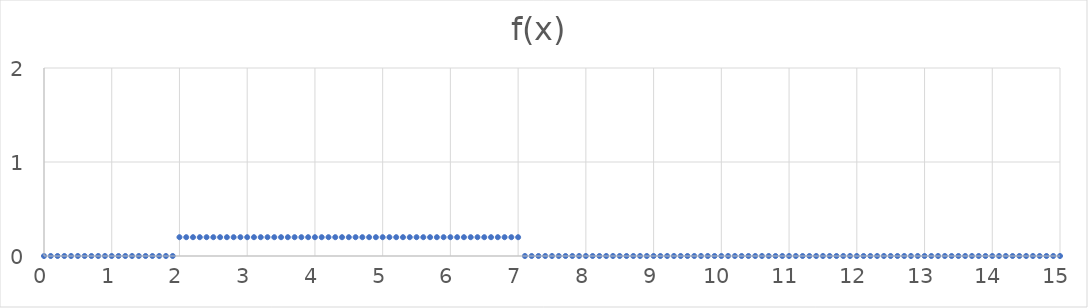
| Category | Series 0 |
|---|---|
| 0.0 | 0 |
| 0.1 | 0 |
| 0.2 | 0 |
| 0.3 | 0 |
| 0.4 | 0 |
| 0.5 | 0 |
| 0.6 | 0 |
| 0.7 | 0 |
| 0.8 | 0 |
| 0.9 | 0 |
| 1.0 | 0 |
| 1.1 | 0 |
| 1.2 | 0 |
| 1.3 | 0 |
| 1.4 | 0 |
| 1.5 | 0 |
| 1.6 | 0 |
| 1.7 | 0 |
| 1.8 | 0 |
| 1.9 | 0 |
| 2.0 | 0.2 |
| 2.1 | 0.2 |
| 2.2 | 0.2 |
| 2.3 | 0.2 |
| 2.4 | 0.2 |
| 2.5 | 0.2 |
| 2.6 | 0.2 |
| 2.7 | 0.2 |
| 2.8 | 0.2 |
| 2.9 | 0.2 |
| 3.0 | 0.2 |
| 3.1 | 0.2 |
| 3.2 | 0.2 |
| 3.3 | 0.2 |
| 3.4 | 0.2 |
| 3.5 | 0.2 |
| 3.6 | 0.2 |
| 3.7 | 0.2 |
| 3.8 | 0.2 |
| 3.9 | 0.2 |
| 4.0 | 0.2 |
| 4.1 | 0.2 |
| 4.2 | 0.2 |
| 4.3 | 0.2 |
| 4.4 | 0.2 |
| 4.5 | 0.2 |
| 4.6 | 0.2 |
| 4.7 | 0.2 |
| 4.8 | 0.2 |
| 4.9 | 0.2 |
| 5.0 | 0.2 |
| 5.1 | 0.2 |
| 5.2 | 0.2 |
| 5.3 | 0.2 |
| 5.4 | 0.2 |
| 5.5 | 0.2 |
| 5.6 | 0.2 |
| 5.7 | 0.2 |
| 5.8 | 0.2 |
| 5.9 | 0.2 |
| 6.0 | 0.2 |
| 6.1 | 0.2 |
| 6.2 | 0.2 |
| 6.3 | 0.2 |
| 6.4 | 0.2 |
| 6.5 | 0.2 |
| 6.6 | 0.2 |
| 6.7 | 0.2 |
| 6.8 | 0.2 |
| 6.9 | 0.2 |
| 7.0 | 0.2 |
| 7.1 | 0 |
| 7.2 | 0 |
| 7.3 | 0 |
| 7.4 | 0 |
| 7.5 | 0 |
| 7.6 | 0 |
| 7.7 | 0 |
| 7.8 | 0 |
| 7.9 | 0 |
| 8.0 | 0 |
| 8.1 | 0 |
| 8.2 | 0 |
| 8.3 | 0 |
| 8.4 | 0 |
| 8.5 | 0 |
| 8.6 | 0 |
| 8.7 | 0 |
| 8.8 | 0 |
| 8.9 | 0 |
| 9.0 | 0 |
| 9.1 | 0 |
| 9.2 | 0 |
| 9.3 | 0 |
| 9.4 | 0 |
| 9.5 | 0 |
| 9.6 | 0 |
| 9.7 | 0 |
| 9.8 | 0 |
| 9.9 | 0 |
| 10.0 | 0 |
| 10.1 | 0 |
| 10.2 | 0 |
| 10.3 | 0 |
| 10.4 | 0 |
| 10.5 | 0 |
| 10.6 | 0 |
| 10.7 | 0 |
| 10.8 | 0 |
| 10.9 | 0 |
| 11.0 | 0 |
| 11.1 | 0 |
| 11.2 | 0 |
| 11.3 | 0 |
| 11.4 | 0 |
| 11.5 | 0 |
| 11.6 | 0 |
| 11.7 | 0 |
| 11.8 | 0 |
| 11.9 | 0 |
| 12.0 | 0 |
| 12.1 | 0 |
| 12.2 | 0 |
| 12.3 | 0 |
| 12.4 | 0 |
| 12.5 | 0 |
| 12.6 | 0 |
| 12.7 | 0 |
| 12.8 | 0 |
| 12.9 | 0 |
| 13.0 | 0 |
| 13.1 | 0 |
| 13.2 | 0 |
| 13.3 | 0 |
| 13.4 | 0 |
| 13.5 | 0 |
| 13.6 | 0 |
| 13.7 | 0 |
| 13.8 | 0 |
| 13.9 | 0 |
| 14.0 | 0 |
| 14.1 | 0 |
| 14.2 | 0 |
| 14.3 | 0 |
| 14.4 | 0 |
| 14.5 | 0 |
| 14.6 | 0 |
| 14.7 | 0 |
| 14.8 | 0 |
| 14.9 | 0 |
| 15.0 | 0 |